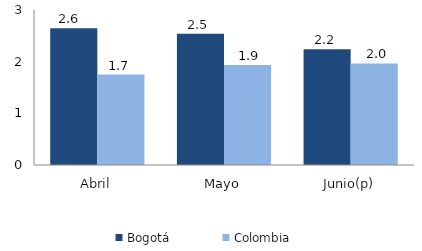
| Category | Bogotá | Colombia |
|---|---|---|
| Abril | 2.647 | 1.75 |
| Mayo | 2.542 | 1.933 |
| Junio(p) | 2.24 | 1.965 |